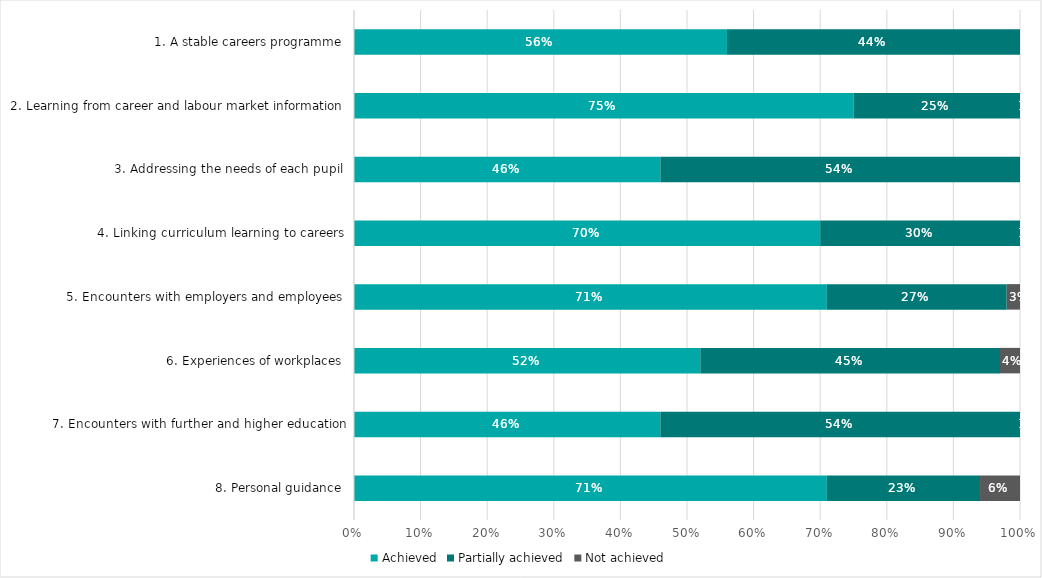
| Category | Achieved | Partially achieved | Not achieved |
|---|---|---|---|
| 8. Personal guidance | 0.71 | 0.23 | 0.06 |
| 7. Encounters with further and higher education | 0.46 | 0.54 | 0.01 |
| 6. Experiences of workplaces | 0.52 | 0.45 | 0.04 |
| 5. Encounters with employers and employees | 0.71 | 0.27 | 0.03 |
| 4. Linking curriculum learning to careers | 0.7 | 0.3 | 0.01 |
| 3. Addressing the needs of each pupil | 0.46 | 0.54 | 0 |
| 2. Learning from career and labour market information | 0.75 | 0.25 | 0.01 |
| 1. A stable careers programme | 0.56 | 0.44 | 0 |